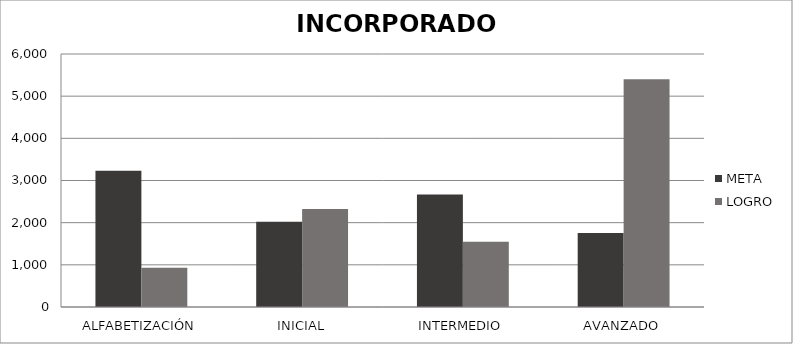
| Category | META | LOGRO |
|---|---|---|
| ALFABETIZACIÓN | 3229 | 931 |
| INICIAL | 2024 | 2322 |
| INTERMEDIO | 2667 | 1547 |
| AVANZADO | 1754 | 5399 |